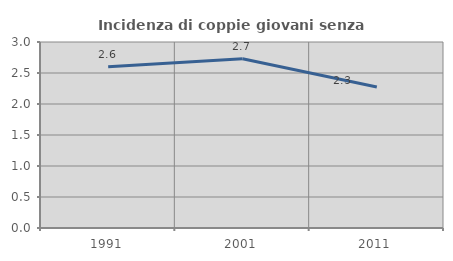
| Category | Incidenza di coppie giovani senza figli |
|---|---|
| 1991.0 | 2.602 |
| 2001.0 | 2.729 |
| 2011.0 | 2.273 |